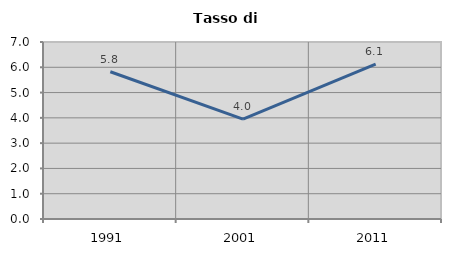
| Category | Tasso di disoccupazione   |
|---|---|
| 1991.0 | 5.825 |
| 2001.0 | 3.95 |
| 2011.0 | 6.123 |